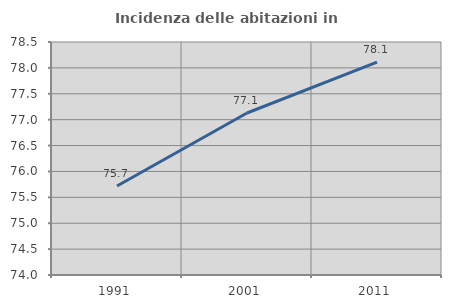
| Category | Incidenza delle abitazioni in proprietà  |
|---|---|
| 1991.0 | 75.718 |
| 2001.0 | 77.128 |
| 2011.0 | 78.11 |